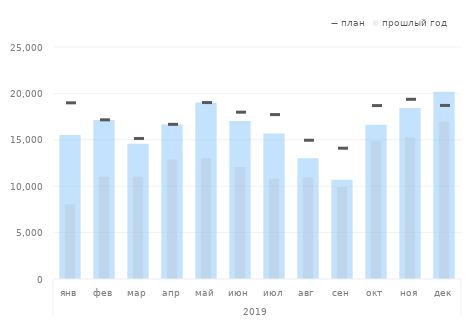
| Category | Выручка | Себестоимость | Валовая прибыль | Расходы | Операционная прибыль |
|---|---|---|---|---|---|
| 0 | 0 | 0 | 15528.96 | 0 | 0 |
| 1 | 0 | 0 | 17142.256 | 0 | 0 |
| 2 | 0 | 0 | 14575.194 | 0 | 0 |
| 3 | 0 | 0 | 16652.602 | 0 | 0 |
| 4 | 0 | 0 | 19012.842 | 0 | 0 |
| 5 | 0 | 0 | 17029.472 | 0 | 0 |
| 6 | 0 | 0 | 15674.169 | 0 | 0 |
| 7 | 0 | 0 | 13004.982 | 0 | 0 |
| 8 | 0 | 0 | 10691.174 | 0 | 0 |
| 9 | 0 | 0 | 16632.696 | 0 | 0 |
| 10 | 0 | 0 | 18418.507 | 0 | 0 |
| 11 | 0 | 0 | 20190.009 | 0 | 0 |